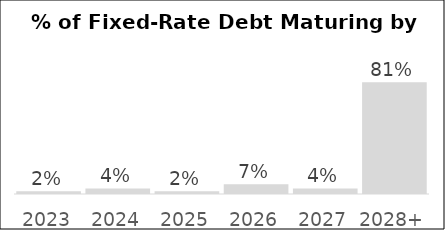
| Category | Series 0 |
|---|---|
| 2023 | 0.02 |
| 2024 | 0.04 |
| 2025 | 0.02 |
| 2026 | 0.07 |
| 2027 | 0.04 |
| 2028+ | 0.81 |